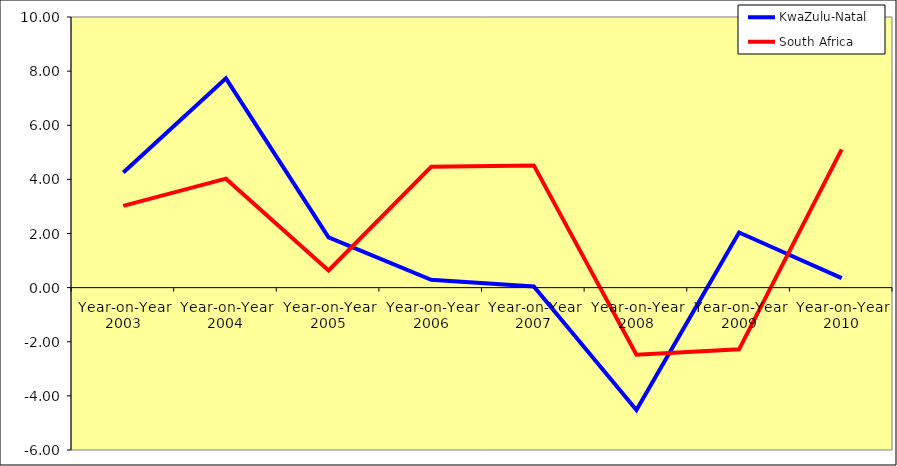
| Category | KwaZulu-Natal | South Africa |
|---|---|---|
| Year-on-Year 2003 | 4.255 | 3.023 |
| Year-on-Year 2004 | 7.734 | 4.027 |
| Year-on-Year 2005 | 1.857 | 0.632 |
| Year-on-Year 2006 | 0.29 | 4.465 |
| Year-on-Year 2007 | 0.044 | 4.517 |
| Year-on-Year 2008 | -4.519 | -2.478 |
| Year-on-Year 2009 | 2.037 | -2.281 |
| Year-on-Year 2010 | 0.349 | 5.107 |